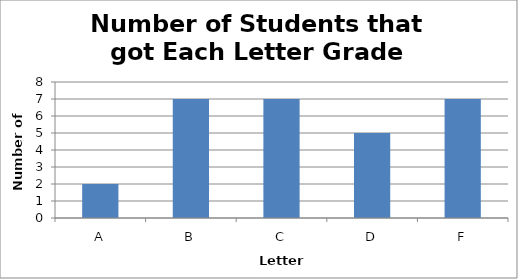
| Category | Series 0 |
|---|---|
| A | 2 |
| B | 7 |
| C | 7 |
| D | 5 |
| F | 7 |